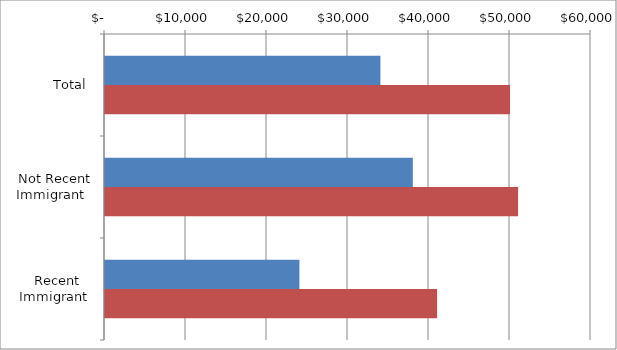
| Category | Series 0 | Series 1 |
|---|---|---|
| Total | 34000 | 50000 |
|  Not Recent Immigrant  | 38000 | 51000 |
|  Recent Immigrant  | 24000 | 41000 |